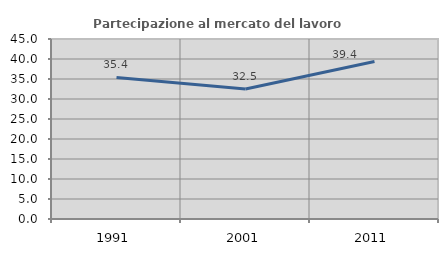
| Category | Partecipazione al mercato del lavoro  femminile |
|---|---|
| 1991.0 | 35.377 |
| 2001.0 | 32.517 |
| 2011.0 | 39.382 |